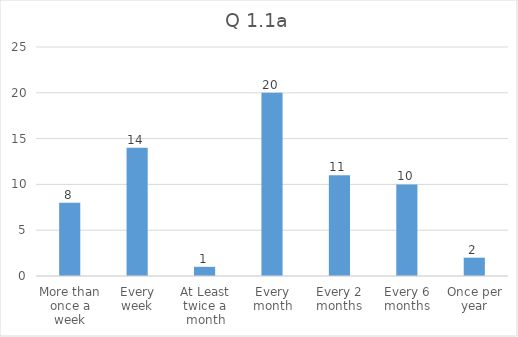
| Category | Total |
|---|---|
| More than once a week | 8 |
| Every week | 14 |
| At Least twice a month | 1 |
| Every month | 20 |
| Every 2 months | 11 |
| Every 6 months | 10 |
| Once per year | 2 |